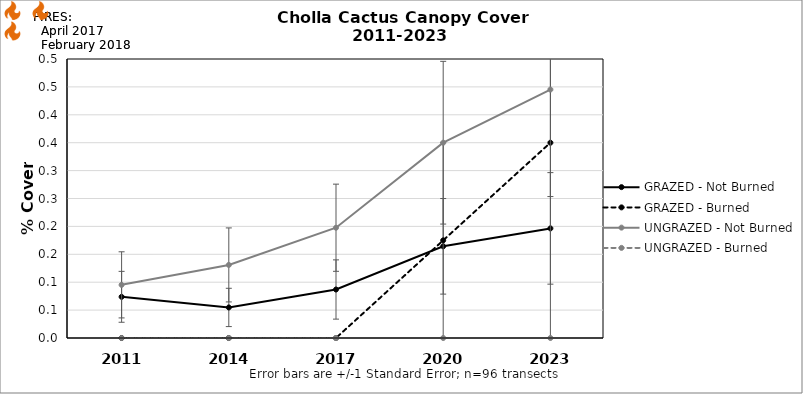
| Category | GRAZED - Not Burned | GRAZED - Burned | UNGRAZED - Not Burned | UNGRAZED - Burned |
|---|---|---|---|---|
| 2011.0 | 0.074 | 0 | 0.095 | 0 |
| 2014.0 | 0.055 | 0 | 0.131 | 0 |
| 2017.0 | 0.087 | 0 | 0.198 | 0 |
| 2020.0 | 0.164 | 0.175 | 0.35 | 0 |
| 2023.0 | 0.196 | 0.35 | 0.445 | 0 |